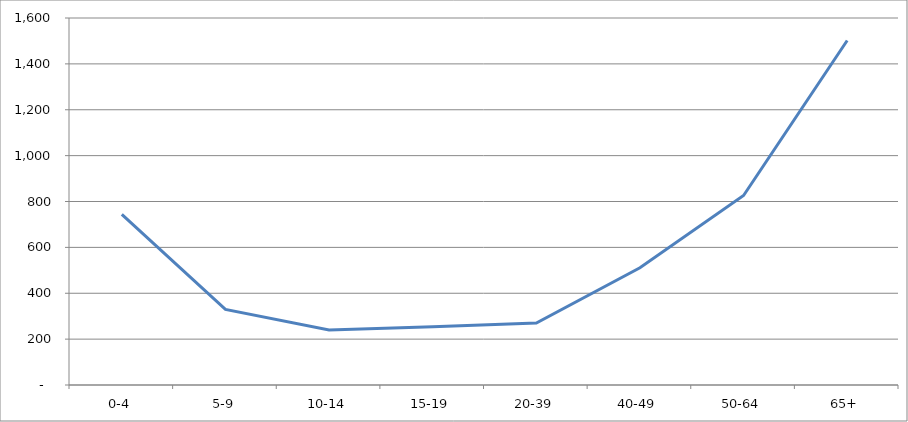
| Category | Series 0 |
|---|---|
| 0-4 | 744.258 |
| 5-9 | 329.466 |
| 10-14 | 239.872 |
| 15-19 | 254.404 |
| 20-39 | 269.83 |
| 40-49 | 511.239 |
| 50-64 | 826.328 |
| 65+ | 1501.729 |